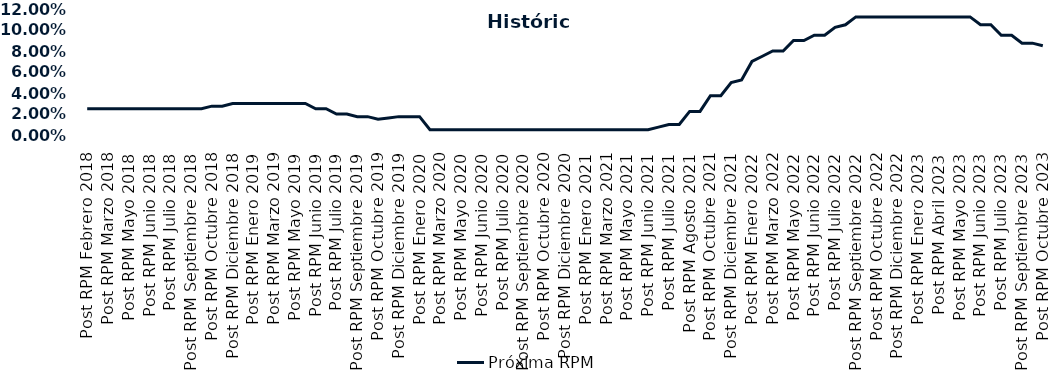
| Category | Próxima RPM |
|---|---|
| Post RPM Febrero 2018 | 0.025 |
| Pre RPM Marzo 2018 | 0.025 |
| Post RPM Marzo 2018 | 0.025 |
| Pre RPM Mayo 2018 | 0.025 |
| Post RPM Mayo 2018 | 0.025 |
| Pre RPM Junio 2018 | 0.025 |
| Post RPM Junio 2018 | 0.025 |
| Pre RPM Julio 2018 | 0.025 |
| Post RPM Julio 2018 | 0.025 |
| Pre RPM Septiembre 2018 | 0.025 |
| Post RPM Septiembre 2018 | 0.025 |
| Pre RPM Octubre 2018 | 0.025 |
| Post RPM Octubre 2018 | 0.028 |
| Pre RPM Diciembre 2018 | 0.028 |
| Post RPM Diciembre 2018 | 0.03 |
| Pre RPM Enero 2019 | 0.03 |
| Post RPM Enero 2019 | 0.03 |
| Pre RPM Marzo 2019 | 0.03 |
| Post RPM Marzo 2019 | 0.03 |
| Pre RPM Mayo 2019 | 0.03 |
| Post RPM Mayo 2019 | 0.03 |
| Pre RPM Junio 2019 | 0.03 |
| Post RPM Junio 2019 | 0.025 |
| Pre RPM Julio 2019 | 0.025 |
| Post RPM Julio 2019 | 0.02 |
| Pre RPM Septiembre 2019 | 0.02 |
| Post RPM Septiembre 2019 | 0.018 |
| Pre RPM Octubre 2019 | 0.018 |
| Post RPM Octubre 2019 | 0.015 |
| Pre RPM Diciembre 2019 | 0.016 |
| Post RPM Diciembre 2019 | 0.018 |
| Pre RPM Enero 2020 | 0.018 |
| Post RPM Enero 2020 | 0.018 |
| Pre RPM Marzo 2020 | 0.005 |
| Post RPM Marzo 2020 | 0.005 |
| Pre RPM Mayo 2020 | 0.005 |
| Post RPM Mayo 2020 | 0.005 |
| Pre RPM Junio 2020 | 0.005 |
| Post RPM Junio 2020 | 0.005 |
| Pre RPM Julio 2020 | 0.005 |
| Post RPM Julio 2020 | 0.005 |
| Pre RPM Septiembre 2020 | 0.005 |
| Post RPM Septiembre 2020 | 0.005 |
| Pre RPM Octubre 2020 | 0.005 |
| Post RPM Octubre 2020 | 0.005 |
| Pre RPM Diciembre 2020 | 0.005 |
| Post RPM Diciembre 2020 | 0.005 |
| Pre RPM Enero 2021 | 0.005 |
| Post RPM Enero 2021 | 0.005 |
| Pre RPM Marzo 2021 | 0.005 |
| Post RPM Marzo 2021 | 0.005 |
| Pre RPM Mayo 2021 | 0.005 |
| Post RPM Mayo 2021 | 0.005 |
| Pre RPM Junio 2021 | 0.005 |
| Post RPM Junio 2021 | 0.005 |
| Pre RPM Julio 2021 | 0.008 |
| Post RPM Julio 2021 | 0.01 |
| Pre RPM Agosto 2021 | 0.01 |
| Post RPM Agosto 2021 | 0.022 |
| Pre RPM Octubre 2021 | 0.022 |
| Post RPM Octubre 2021 | 0.038 |
| Pre RPM Diciembre 2021 | 0.038 |
| Post RPM Diciembre 2021 | 0.05 |
| Pre RPM Enero 2022 | 0.052 |
| Post RPM Enero 2022 | 0.07 |
| Pre RPM Marzo 2022 | 0.075 |
| Post RPM Marzo 2022 | 0.08 |
| Pre RPM Mayo 2022 | 0.08 |
| Post RPM Mayo 2022 | 0.09 |
| Pre RPM Junio 2022 | 0.09 |
| Post RPM Junio 2022 | 0.095 |
| Pre RPM Julio 2022 | 0.095 |
| Post RPM Julio 2022 | 0.102 |
| Pre RPM Septiembre 2022 | 0.105 |
| Post RPM Septiembre 2022 | 0.112 |
| Pre RPM Octubre 2022 | 0.112 |
| Post RPM Octubre 2022 | 0.112 |
| Pre RPM Diciembre 2022 | 0.112 |
| Post RPM Diciembre 2022 | 0.112 |
| Pre RPM Enero 2023 | 0.112 |
| Post RPM Enero 2023 | 0.112 |
| Pre RPM Abril 2023 | 0.112 |
| Post RPM Abril 2023 | 0.112 |
| Pre RPM Mayo 2023 | 0.112 |
| Post RPM Mayo 2023 | 0.112 |
| Pre RPM Junio 2023 | 0.112 |
| Post RPM Junio 2023 | 0.105 |
| Pre RPM Julio 2023 | 0.105 |
| Post RPM Julio 2023 | 0.095 |
| Pre RPM Septiembre 2023 | 0.095 |
| Post RPM Septiembre 2023 | 0.088 |
| Pre RPM Octubre 2023 | 0.088 |
| Post RPM Octubre 2023 | 0.085 |